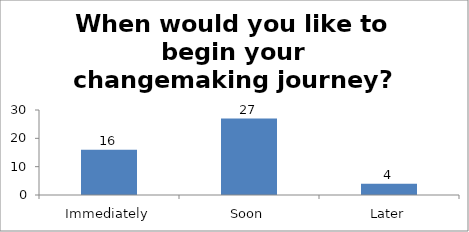
| Category | When would you like to begin your changemaking journey?  |
|---|---|
| Immediately | 16 |
| Soon | 27 |
| Later | 4 |